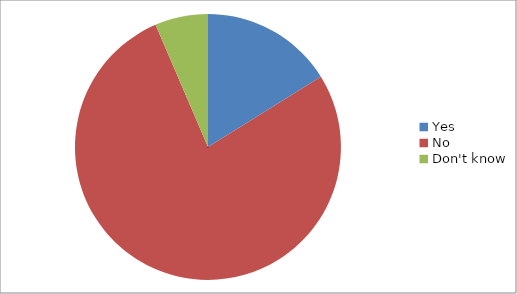
| Category | Series 0 | Series 1 |
|---|---|---|
| Yes | 5 | 0.161 |
| No | 24 | 0.774 |
| Don't know | 2 | 0.065 |